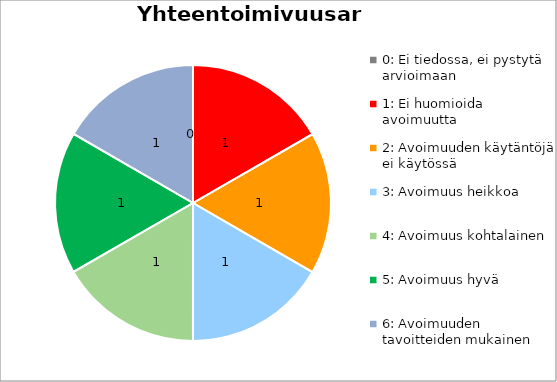
| Category | Series 0 |
|---|---|
| 0: Ei tiedossa, ei pystytä arvioimaan | 0 |
| 1: Ei huomioida avoimuutta | 1 |
| 2: Avoimuuden käytäntöjä ei käytössä | 1 |
| 3: Avoimuus heikkoa | 1 |
| 4: Avoimuus kohtalainen | 1 |
| 5: Avoimuus hyvä | 1 |
| 6: Avoimuuden tavoitteiden mukainen | 1 |